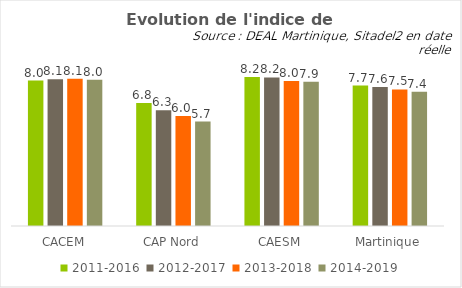
| Category | 2011-2016 | 2012-2017 | 2013-2018 | 2014-2019 |
|---|---|---|---|---|
| CACEM | 7.983 | 8.051 | 8.085 | 8.029 |
| CAP Nord | 6.755 | 6.347 | 6.032 | 5.729 |
| CAESM | 8.177 | 8.15 | 7.959 | 7.917 |
| Martinique | 7.706 | 7.622 | 7.491 | 7.373 |